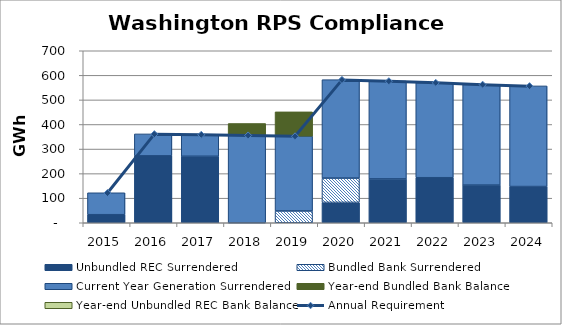
| Category | Unbundled REC Surrendered | Bundled Bank Surrendered | Current Year Generation Surrendered | Compliance Shortfall | Year-end Bundled Bank Balance | Year-end Unbundled REC Bank Balance | Bundled Bank Sales |
|---|---|---|---|---|---|---|---|
| 2015.0 | 32.759 | 0 | 89.219 | 0 | 0 | 0 | 0 |
| 2016.0 | 272.231 | 0 | 89.393 | 0 | 0 | 0 | 0 |
| 2017.0 | 270.577 | 0 | 88.478 | 0 | 0 | 0 | 0 |
| 2018.0 | 0 | 0 | 356.353 | 0 | 47.673 | 0 | 0 |
| 2019.0 | 0 | 48.029 | 304.736 | 0 | 98.592 | 0 | 0 |
| 2020.0 | 82.84 | 98.897 | 400.623 | 0 | 0 | 0 | 0 |
| 2021.0 | 178.477 | 0 | 398.525 | 0 | 0 | 0 | 0 |
| 2022.0 | 183.277 | 0 | 387.137 | 0 | 0 | 0 | 0 |
| 2023.0 | 153.26 | 0 | 409.686 | 0 | 0 | 0 | 0 |
| 2024.0 | 147.343 | 0 | 409.605 | 0 | 0 | 0 | 0 |